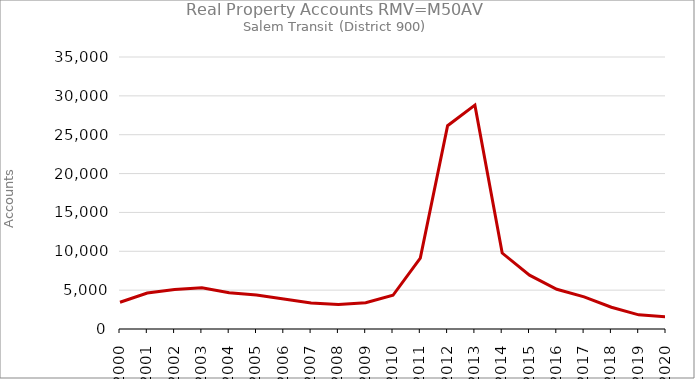
| Category | Series 0 |
|---|---|
| 2000.0 | 3445 |
| 2001.0 | 4631 |
| 2002.0 | 5087 |
| 2003.0 | 5298 |
| 2004.0 | 4679 |
| 2005.0 | 4369 |
| 2006.0 | 3860 |
| 2007.0 | 3357 |
| 2008.0 | 3150 |
| 2009.0 | 3385 |
| 2010.0 | 4337 |
| 2011.0 | 9115 |
| 2012.0 | 26159 |
| 2013.0 | 28803 |
| 2014.0 | 9773 |
| 2015.0 | 6931 |
| 2016.0 | 5118 |
| 2017.0 | 4143 |
| 2018.0 | 2801 |
| 2019.0 | 1820 |
| 2020.0 | 1578 |